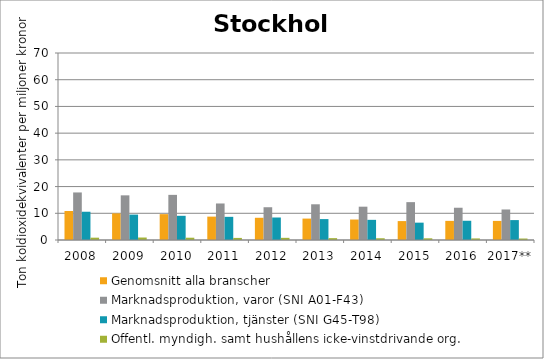
| Category | Genomsnitt alla branscher | Marknadsproduktion, varor (SNI A01-F43) | Marknadsproduktion, tjänster (SNI G45-T98) | Offentl. myndigh. samt hushållens icke-vinstdrivande org. |
|---|---|---|---|---|
| 2008 | 10.85 | 17.8 | 10.58 | 0.871 |
| 2009 | 9.966 | 16.717 | 9.507 | 0.93 |
| 2010 | 9.678 | 16.896 | 9.056 | 0.856 |
| 2011 | 8.751 | 13.672 | 8.673 | 0.781 |
| 2012 | 8.32 | 12.266 | 8.421 | 0.811 |
| 2013 | 8.016 | 13.371 | 7.827 | 0.698 |
| 2014 | 7.662 | 12.47 | 7.545 | 0.656 |
| 2015 | 7.081 | 14.173 | 6.493 | 0.633 |
| 2016 | 7.158 | 12.076 | 7.205 | 0.592 |
| 2017** | 7.15 | 11.426 | 7.455 | 0.554 |